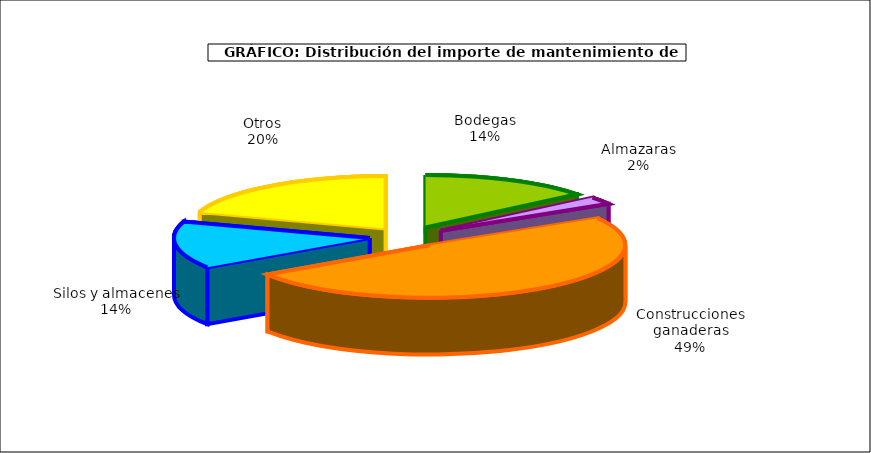
| Category | Series 0 |
|---|---|
| 0 | 75.99 |
| 1 | 12.314 |
| 2 | 265.04 |
| 3 | 78.096 |
| 4 | 107.399 |